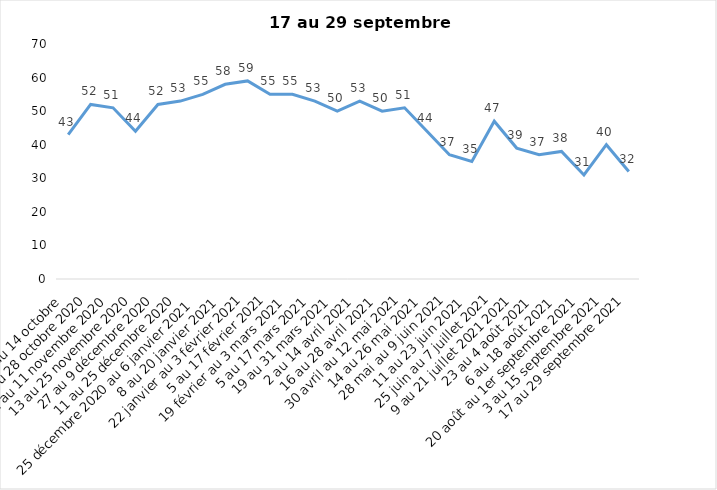
| Category | Toujours aux trois mesures |
|---|---|
| 2 au 14 octobre  | 43 |
| 16 au 28 octobre 2020 | 52 |
| 30 octobre au 11 novembre 2020 | 51 |
| 13 au 25 novembre 2020 | 44 |
| 27 au 9 décembre 2020 | 52 |
| 11 au 25 décembre 2020 | 53 |
| 25 décembre 2020 au 6 janvier 2021 | 55 |
| 8 au 20 janvier 2021 | 58 |
| 22 janvier au 3 février 2021 | 59 |
| 5 au 17 février 2021 | 55 |
| 19 février au 3 mars 2021 | 55 |
| 5 au 17 mars 2021 | 53 |
| 19 au 31 mars 2021 | 50 |
| 2 au 14 avril 2021 | 53 |
| 16 au 28 avril 2021 | 50 |
| 30 avril au 12 mai 2021 | 51 |
| 14 au 26 mai 2021 | 44 |
| 28 mai au 9 juin 2021 | 37 |
| 11 au 23 juin 2021 | 35 |
| 25 juin au 7 juillet 2021 | 47 |
| 9 au 21 juillet 2021 2021 | 39 |
| 23 au 4 août 2021 | 37 |
| 6 au 18 août 2021 | 38 |
| 20 août au 1er septembre 2021 | 31 |
| 3 au 15 septembre 2021 | 40 |
| 17 au 29 septembre 2021 | 32 |